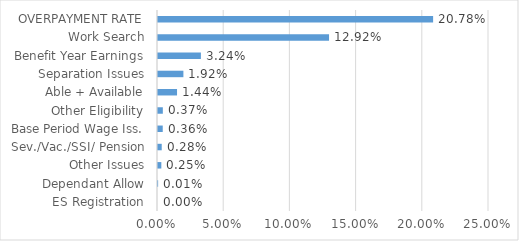
| Category | Series 0 |
|---|---|
| ES Registration | 0 |
| Dependant Allow | 0 |
| Other Issues | 0.003 |
| Sev./Vac./SSI/ Pension | 0.003 |
| Base Period Wage Iss. | 0.004 |
| Other Eligibility | 0.004 |
| Able + Available | 0.014 |
| Separation Issues | 0.019 |
| Benefit Year Earnings | 0.032 |
| Work Search | 0.129 |
| OVERPAYMENT RATE | 0.208 |